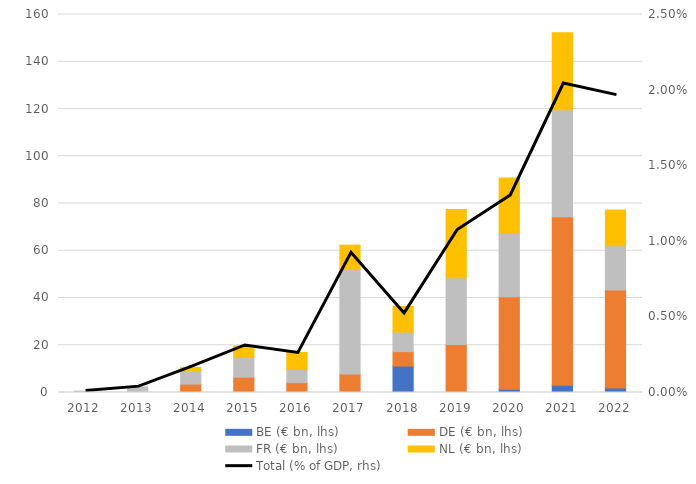
| Category | BE (€ bn, lhs) | DE (€ bn, lhs) | FR (€ bn, lhs) | NL (€ bn, lhs) |
|---|---|---|---|---|
| 2012 | 0 | 0 | 0.588 | 0 |
| 2013 | 0 | 0.315 | 2.005 | 0 |
| 2014 | 0 | 3.564 | 5.696 | 1.286 |
| 2015 | 0 | 6.473 | 8.503 | 4.72 |
| 2016 | 0.056 | 4.131 | 5.714 | 7.094 |
| 2017 | 0 | 7.78 | 44.233 | 10.363 |
| 2018 | 11.193 | 6.102 | 8.252 | 10.919 |
| 2019 | 0 | 20.365 | 28.159 | 28.986 |
| 2020 | 1.349 | 39.173 | 26.733 | 23.495 |
| 2021 | 3.049 | 71.32 | 45.323 | 32.596 |
| 2022 | 1.869 | 41.505 | 18.777 | 15.087 |